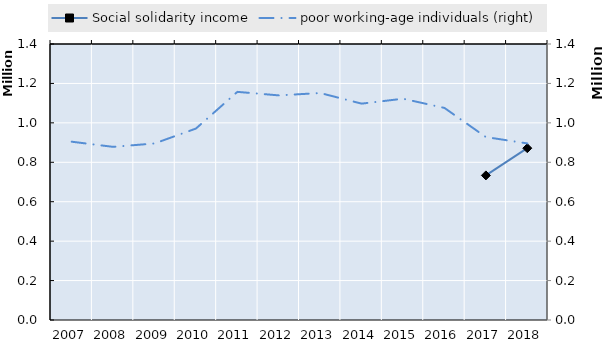
| Category | Social solidarity income | Series 4 | Series 5 | Series 6 | Series 7 | Series 8 | Series 9 | Series 10 | Series 11 | Series 12 | Series 13 | Series 14 | Series 15 | Series 16 | Series 17 | Series 18 | Series 19 |
|---|---|---|---|---|---|---|---|---|---|---|---|---|---|---|---|---|---|
| 2007.0 | 0 |  |  |  |  |  |  |  |  |  |  |  |  |  |  |  |  |
| 2008.0 | 0 |  |  |  |  |  |  |  |  |  |  |  |  |  |  |  |  |
| 2009.0 | 0 |  |  |  |  |  |  |  |  |  |  |  |  |  |  |  |  |
| 2010.0 | 0 |  |  |  |  |  |  |  |  |  |  |  |  |  |  |  |  |
| 2011.0 | 0 |  |  |  |  |  |  |  |  |  |  |  |  |  |  |  |  |
| 2012.0 | 0 |  |  |  |  |  |  |  |  |  |  |  |  |  |  |  |  |
| 2013.0 | 0 |  |  |  |  |  |  |  |  |  |  |  |  |  |  |  |  |
| 2014.0 | 0 |  |  |  |  |  |  |  |  |  |  |  |  |  |  |  |  |
| 2015.0 | 0 |  |  |  |  |  |  |  |  |  |  |  |  |  |  |  |  |
| 2016.0 | 0 |  |  |  |  |  |  |  |  |  |  |  |  |  |  |  |  |
| 2017.0 | 733525 |  |  |  |  |  |  |  |  |  |  |  |  |  |  |  |  |
| 2018.0 | 871491 |  |  |  |  |  |  |  |  |  |  |  |  |  |  |  |  |